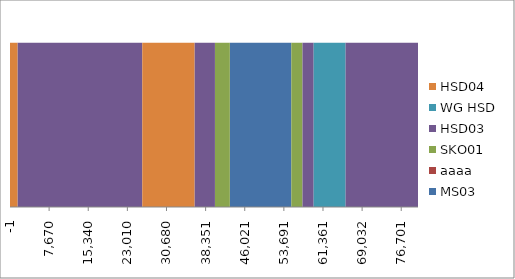
| Category | MS03 | aaaa | SKO01 | HSD03 | WG HSD | HSD04 |
|---|---|---|---|---|---|---|
| 0.0 | 0 | 0 | 0 | 0 | 0 | 1 |
| 1179.0 | 0 | 0 | 0 | 0 | 0 | 1 |
| 1179.0 | 0 | 0 | 0 | 1 | 0 | 0 |
| 25887.0 | 0 | 0 | 0 | 1 | 0 | 0 |
| 25887.0 | 0 | 0 | 0 | 0 | 0 | 1 |
| 35979.0 | 0 | 0 | 0 | 0 | 0 | 1 |
| 35979.0 | 0 | 0 | 0 | 1 | 0 | 0 |
| 40025.0 | 0 | 0 | 0 | 1 | 0 | 0 |
| 40025.0 | 0 | 0 | 1 | 0 | 0 | 0 |
| 42819.0 | 0 | 0 | 1 | 0 | 0 | 0 |
| 42819.0 | 1 | 0 | 0 | 0 | 0 | 0 |
| 54828.0 | 1 | 0 | 0 | 0 | 0 | 0 |
| 54828.0 | 0 | 0 | 1 | 0 | 0 | 0 |
| 57042.0 | 0 | 0 | 1 | 0 | 0 | 0 |
| 57042.0 | 0 | 0 | 0 | 1 | 0 | 0 |
| 59234.0 | 0 | 0 | 0 | 1 | 0 | 0 |
| 59234.0 | 0 | 0 | 0 | 0 | 1 | 0 |
| 65388.0 | 0 | 0 | 0 | 0 | 1 | 0 |
| 65388.0 | 0 | 0 | 0 | 1 | 0 | 0 |
| 79800.0 | 0 | 0 | 0 | 1 | 0 | 0 |
| 79800.0 | 0 | 0 | 0 | 0 | 0 | 0 |